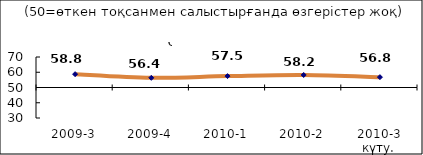
| Category | Диф.индекс ↓ |
|---|---|
| 2009-3 | 58.75 |
| 2009-4 | 56.36 |
| 2010-1 | 57.475 |
| 2010-2 | 58.215 |
| 2010-3 күту. | 56.79 |